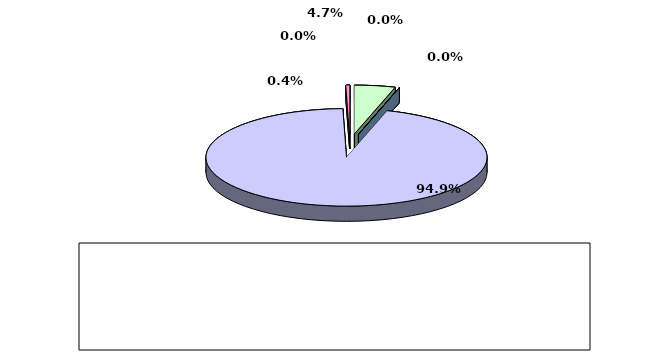
| Category | Series 0 |
|---|---|
| מזומנים ושווי מזומנים | 0.047 |
| אג"ח ממשלתיות סחירות | 0 |
| אג"ח קונצרני סחיר | 0 |
| ני"ע אחרים סחירים | 0.949 |
| פקדונות והלוואות | 0 |
| השקעות אחרות | 0.004 |